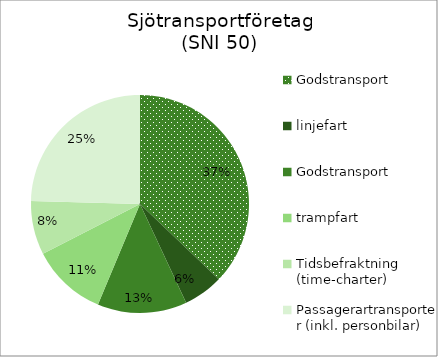
| Category | Godstransport, linjefart Godstransport, trampfart Tidsbefraktning (time-charter) Passagerartransporter (inkl. personbilar) Personaluthyrning för drift och bemanning av andras fartyg Övrigt |
|---|---|
| 0 | 11958.172 |
| 1 | 1899.379 |
| 2 | 4267.485 |
| 3 | 3597.143 |
| 4 | 2561.995 |
| 5 | 7908.339 |